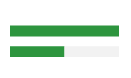
| Category | Series 0 | Series 1 |
|---|---|---|
| 0 | 0 | 0 |
| 1 | 1 | 0 |
| 2 | 0.5 | 0.5 |